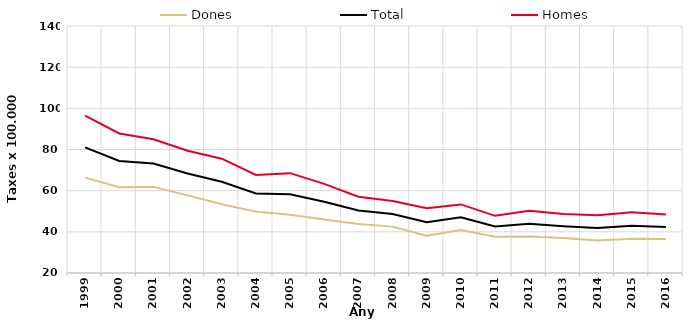
| Category | Dones | Total | Homes |
|---|---|---|---|
| 1999.0 | 66.329 | 81.045 | 96.47 |
| 2000.0 | 61.701 | 74.45 | 87.8 |
| 2001.0 | 61.835 | 73.163 | 85.001 |
| 2002.0 | 57.714 | 68.345 | 79.366 |
| 2003.0 | 53.387 | 64.292 | 75.547 |
| 2004.0 | 49.819 | 58.62 | 67.671 |
| 2005.0 | 48.312 | 58.295 | 68.517 |
| 2006.0 | 46.039 | 54.571 | 63.284 |
| 2007.0 | 43.84 | 50.402 | 57.088 |
| 2008.0 | 42.534 | 48.707 | 54.983 |
| 2009.0 | 38.06 | 44.69 | 51.45 |
| 2010.0 | 40.86 | 47.03 | 53.32 |
| 2011.0 | 37.65 | 42.65 | 47.77 |
| 2012.0 | 37.73 | 43.92 | 50.29 |
| 2013.0 | 36.96 | 42.72 | 48.66 |
| 2014.0 | 35.78 | 41.82 | 48.09 |
| 2015.0 | 36.69 | 42.95 | 49.46 |
| 2016.0 | 36.54 | 42.36 | 48.41 |